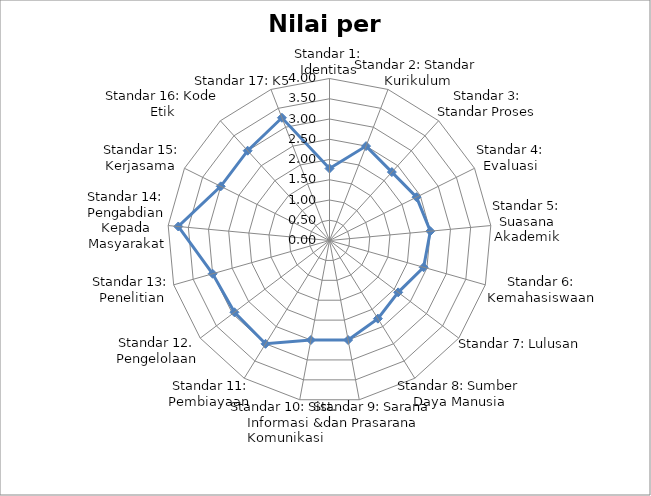
| Category | Nilai per standar |
|---|---|
| Standar 1: Identitas | 1.778 |
| Standar 2: Standar Kurikulum | 2.5 |
| Standar 3: Standar Proses | 2.286 |
| Standar 4: Evaluasi | 2.4 |
| Standar 5: Suasana Akademik | 2.5 |
| Standar 6: Kemahasiswaan | 2.417 |
| Standar 7: Lulusan  | 2.125 |
| Standar 8: Sumber Daya Manusia | 2.269 |
| Standar 9: Sarana dan Prasarana  | 2.5 |
| Standar 10: Sist. Informasi & Komunikasi | 2.5 |
| Standar 11: Pembiayaan  | 3 |
| Standar 12. Pengelolaan | 2.941 |
| Standar 13: Penelitian | 3 |
| Standar 14: Pengabdian Kepada Masyarakat | 3.75 |
| Standar 15: Kerjasama  | 3 |
| Standar 16: Kode Etik | 3 |
| Standar 17: K5 | 3.25 |